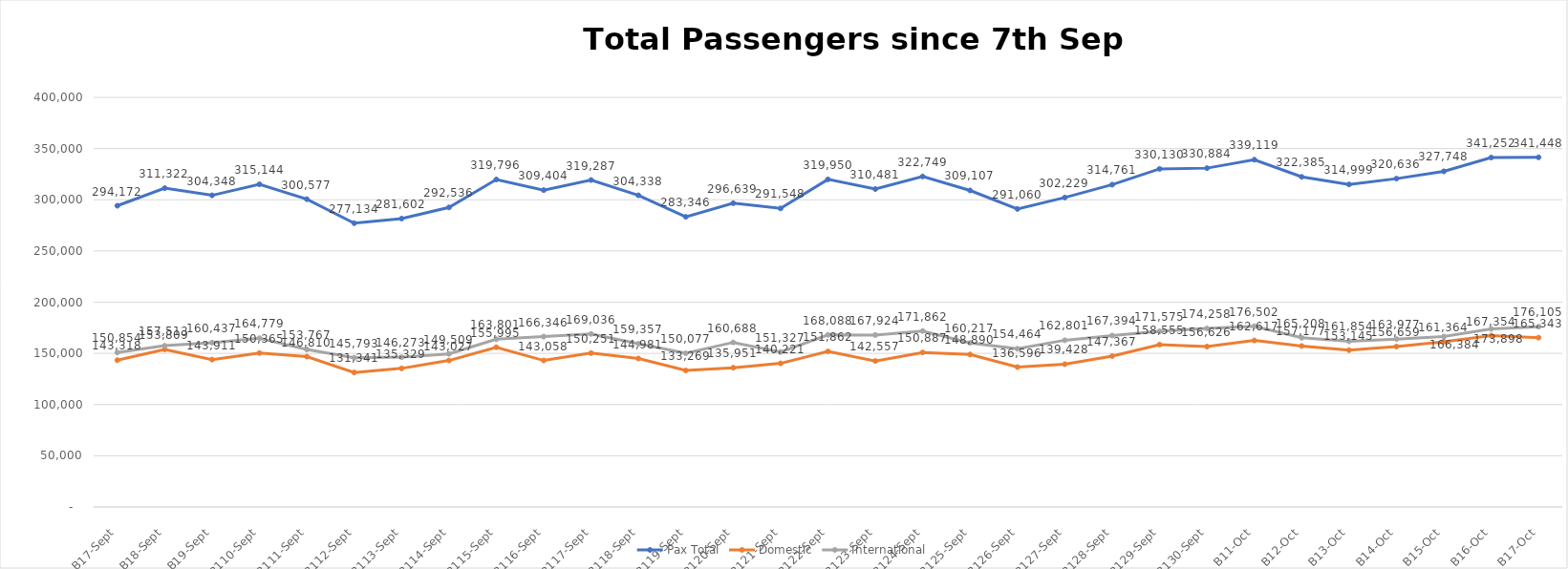
| Category | Pax Total | Domestic | International |
|---|---|---|---|
| 2023-09-07 | 294172 | 143318 | 150854 |
| 2023-09-08 | 311322 | 153809 | 157513 |
| 2023-09-09 | 304348 | 143911 | 160437 |
| 2023-09-10 | 315144 | 150365 | 164779 |
| 2023-09-11 | 300577 | 146810 | 153767 |
| 2023-09-12 | 277134 | 131341 | 145793 |
| 2023-09-13 | 281602 | 135329 | 146273 |
| 2023-09-14 | 292536 | 143027 | 149509 |
| 2023-09-15 | 319796 | 155995 | 163801 |
| 2023-09-16 | 309404 | 143058 | 166346 |
| 2023-09-17 | 319287 | 150251 | 169036 |
| 2023-09-18 | 304338 | 144981 | 159357 |
| 2023-09-19 | 283346 | 133269 | 150077 |
| 2023-09-20 | 296639 | 135951 | 160688 |
| 2023-09-21 | 291548 | 140221 | 151327 |
| 2023-09-22 | 319950 | 151862 | 168088 |
| 2023-09-23 | 310481 | 142557 | 167924 |
| 2023-09-24 | 322749 | 150887 | 171862 |
| 2023-09-25 | 309107 | 148890 | 160217 |
| 2023-09-26 | 291060 | 136596 | 154464 |
| 2023-09-27 | 302229 | 139428 | 162801 |
| 2023-09-28 | 314761 | 147367 | 167394 |
| 2023-09-29 | 330130 | 158555 | 171575 |
| 2023-09-30 | 330884 | 156626 | 174258 |
| 2023-10-01 | 339119 | 162617 | 176502 |
| 2023-10-02 | 322385 | 157177 | 165208 |
| 2023-10-03 | 314999 | 153145 | 161854 |
| 2023-10-04 | 320636 | 156659 | 163977 |
| 2023-10-05 | 327748 | 161364 | 166384 |
| 2023-10-06 | 341252 | 167354 | 173898 |
| 2023-10-07 | 341448 | 165343 | 176105 |